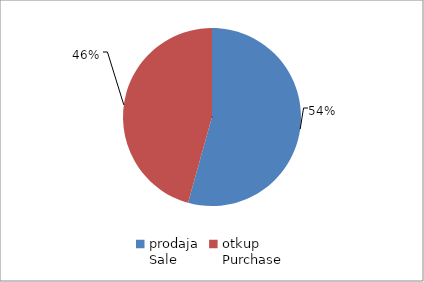
| Category | Series 0 |
|---|---|
| prodaja
Sale | 13766562 |
| otkup
Purchase | 11566394 |